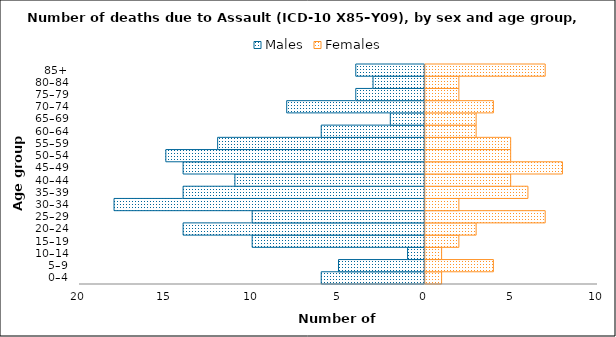
| Category | Males | Females |
|---|---|---|
| 0–4 | -6 | 1 |
| 5–9 | -5 | 4 |
| 10–14 | -1 | 1 |
| 15–19 | -10 | 2 |
| 20–24 | -14 | 3 |
| 25–29 | -10 | 7 |
| 30–34 | -18 | 2 |
| 35–39 | -14 | 6 |
| 40–44 | -11 | 5 |
| 45–49 | -14 | 8 |
| 50–54 | -15 | 5 |
| 55–59 | -12 | 5 |
| 60–64 | -6 | 3 |
| 65–69 | -2 | 3 |
| 70–74 | -8 | 4 |
| 75–79 | -4 | 2 |
| 80–84 | -3 | 2 |
| 85+ | -4 | 7 |